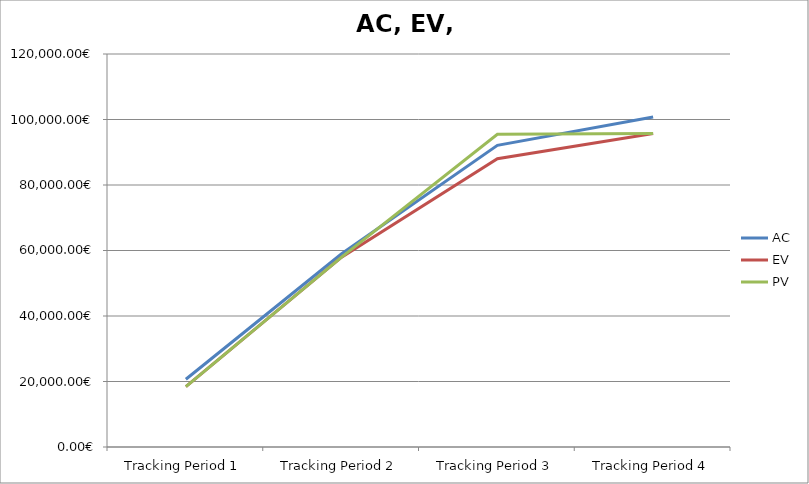
| Category | AC | EV | PV |
|---|---|---|---|
| Tracking Period 1 | 20690 | 18461 | 18461 |
| Tracking Period 2 | 58998 | 57960 | 57960 |
| Tracking Period 3 | 92123 | 88000 | 95494 |
| Tracking Period 4 | 100763 | 95694 | 95694 |